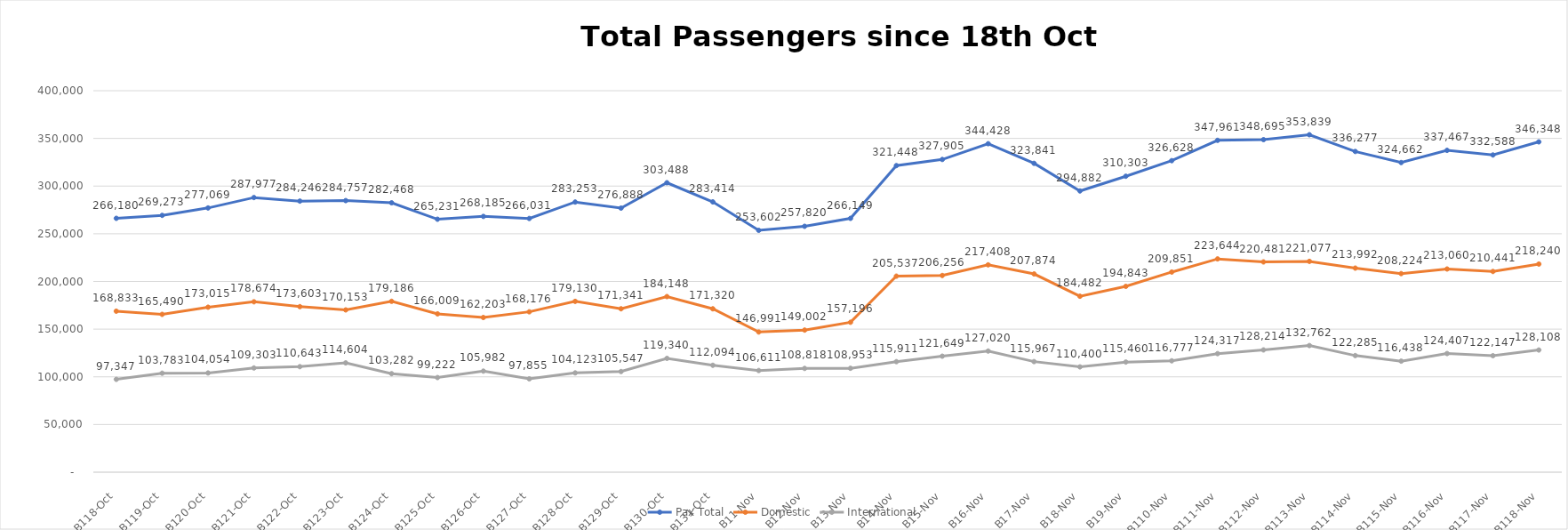
| Category | Pax Total |  Domestic  |  International  |
|---|---|---|---|
| 2022-10-18 | 266180 | 168833 | 97347 |
| 2022-10-19 | 269273 | 165490 | 103783 |
| 2022-10-20 | 277069 | 173015 | 104054 |
| 2022-10-21 | 287977 | 178674 | 109303 |
| 2022-10-22 | 284246 | 173603 | 110643 |
| 2022-10-23 | 284757 | 170153 | 114604 |
| 2022-10-24 | 282468 | 179186 | 103282 |
| 2022-10-25 | 265231 | 166009 | 99222 |
| 2022-10-26 | 268185 | 162203 | 105982 |
| 2022-10-27 | 266031 | 168176 | 97855 |
| 2022-10-28 | 283253 | 179130 | 104123 |
| 2022-10-29 | 276888 | 171341 | 105547 |
| 2022-10-30 | 303488 | 184148 | 119340 |
| 2022-10-31 | 283414 | 171320 | 112094 |
| 2022-11-01 | 253602 | 146991 | 106611 |
| 2022-11-02 | 257820 | 149002 | 108818 |
| 2022-11-03 | 266149 | 157196 | 108953 |
| 2022-11-04 | 321448 | 205537 | 115911 |
| 2022-11-05 | 327905 | 206256 | 121649 |
| 2022-11-06 | 344428 | 217408 | 127020 |
| 2022-11-07 | 323841 | 207874 | 115967 |
| 2022-11-08 | 294882 | 184482 | 110400 |
| 2022-11-09 | 310303 | 194843 | 115460 |
| 2022-11-10 | 326628 | 209851 | 116777 |
| 2022-11-11 | 347961 | 223644 | 124317 |
| 2022-11-12 | 348695 | 220481 | 128214 |
| 2022-11-13 | 353839 | 221077 | 132762 |
| 2022-11-14 | 336277 | 213992 | 122285 |
| 2022-11-15 | 324662 | 208224 | 116438 |
| 2022-11-16 | 337467 | 213060 | 124407 |
| 2022-11-17 | 332588 | 210441 | 122147 |
| 2022-11-18 | 346348 | 218240 | 128108 |